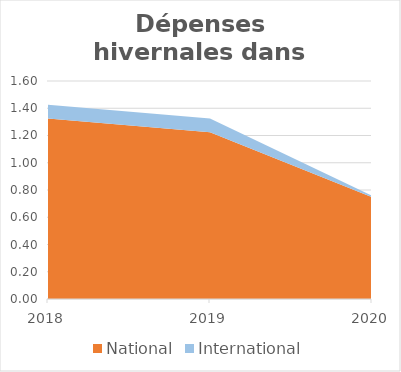
| Category | National | International |
|---|---|---|
| 2018.0 | 1.325 | 0.1 |
| 2019.0 | 1.224 | 0.1 |
| 2020.0 | 0.748 | 0.01 |